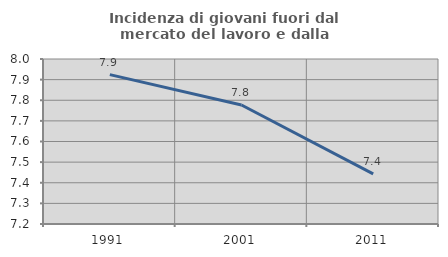
| Category | Incidenza di giovani fuori dal mercato del lavoro e dalla formazione  |
|---|---|
| 1991.0 | 7.924 |
| 2001.0 | 7.777 |
| 2011.0 | 7.443 |